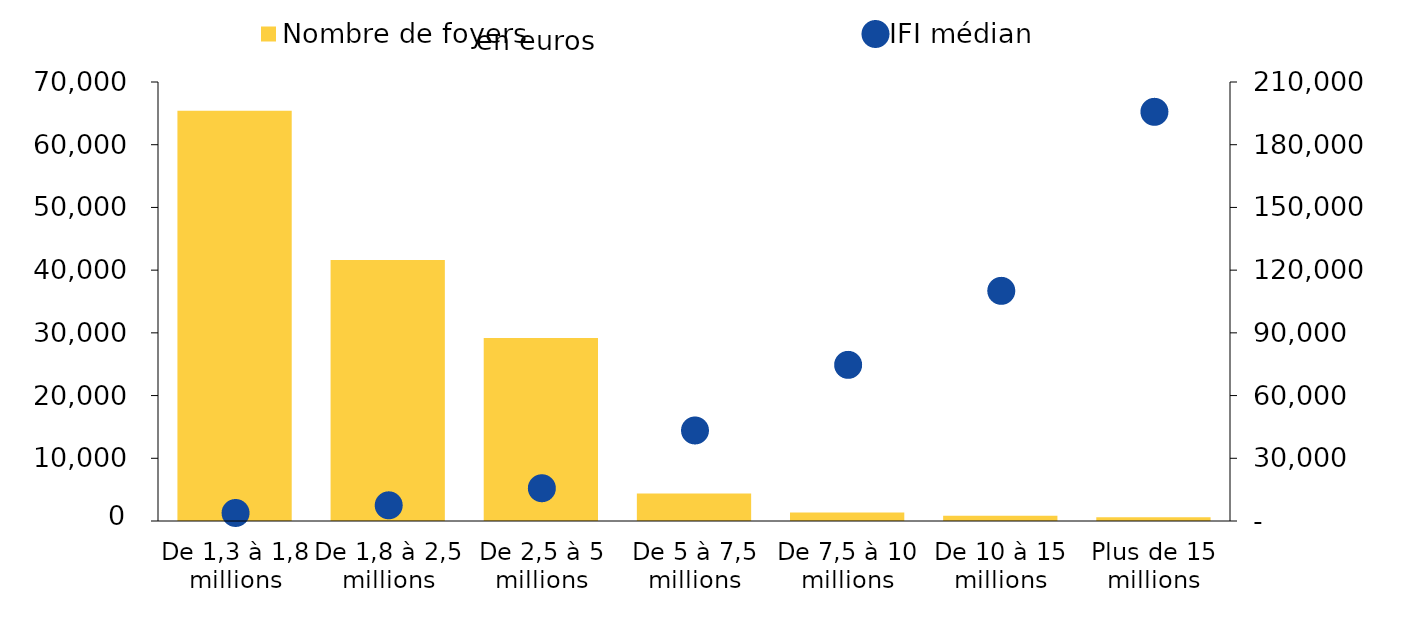
| Category | Nombre de foyers |
|---|---|
| De 1,3 à 1,8 millions | 65408 |
| De 1,8 à 2,5 millions | 41605 |
| De 2,5 à 5 millions | 29183 |
| De 5 à 7,5 millions | 4373 |
| De 7,5 à 10 millions | 1344 |
| De 10 à 15 millions | 838 |
| Plus de 15 millions | 586 |